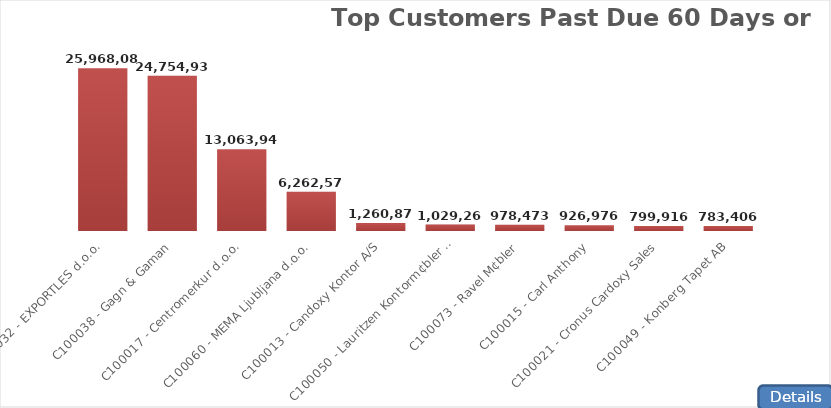
| Category | Total |
|---|---|
| C100032 - EXPORTLES d.o.o. | 25968085 |
| C100038 - Gagn & Gaman | 24754934.19 |
| C100017 - Centromerkur d.o.o. | 13063948 |
| C100060 - MEMA Ljubljana d.o.o. | 6262577.5 |
| C100013 - Candoxy Kontor A/S | 1260877.86 |
| C100050 - Lauritzen Kontorm¢bler A/S | 1029263.89 |
| C100073 - Ravel M¢bler | 978473.23 |
| C100015 - Carl Anthony | 926975.68 |
| C100021 - Cronus Cardoxy Sales | 799915.83 |
| C100049 - Konberg Tapet AB | 783406.2 |